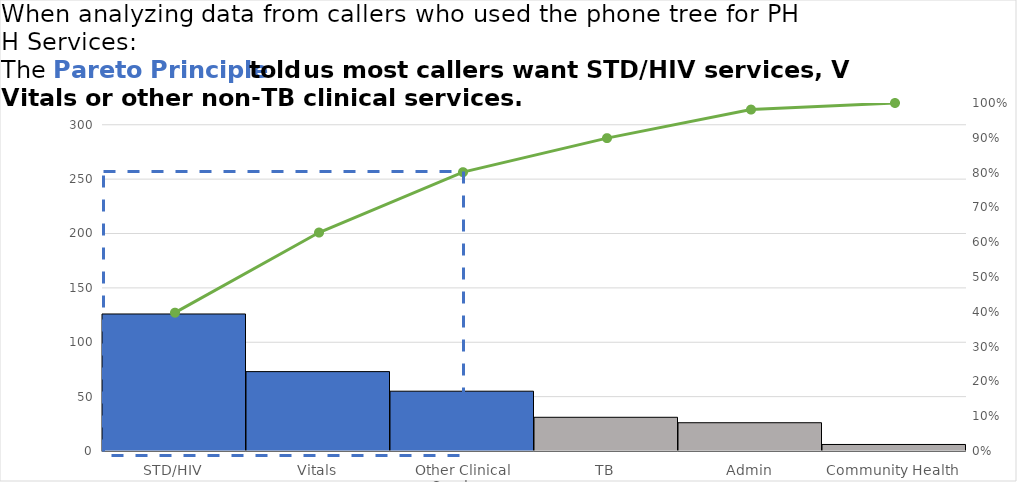
| Category | 126 |
|---|---|
| STD/HIV | 126 |
| Vitals | 73 |
| Other Clinical Services | 55 |
| TB | 31 |
| Admin | 26 |
| Community Health | 6 |